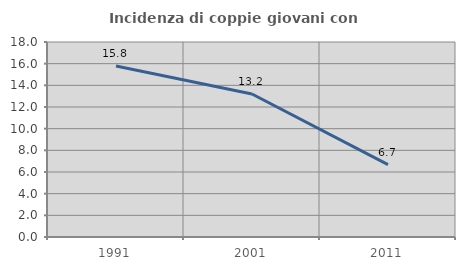
| Category | Incidenza di coppie giovani con figli |
|---|---|
| 1991.0 | 15.789 |
| 2001.0 | 13.201 |
| 2011.0 | 6.686 |